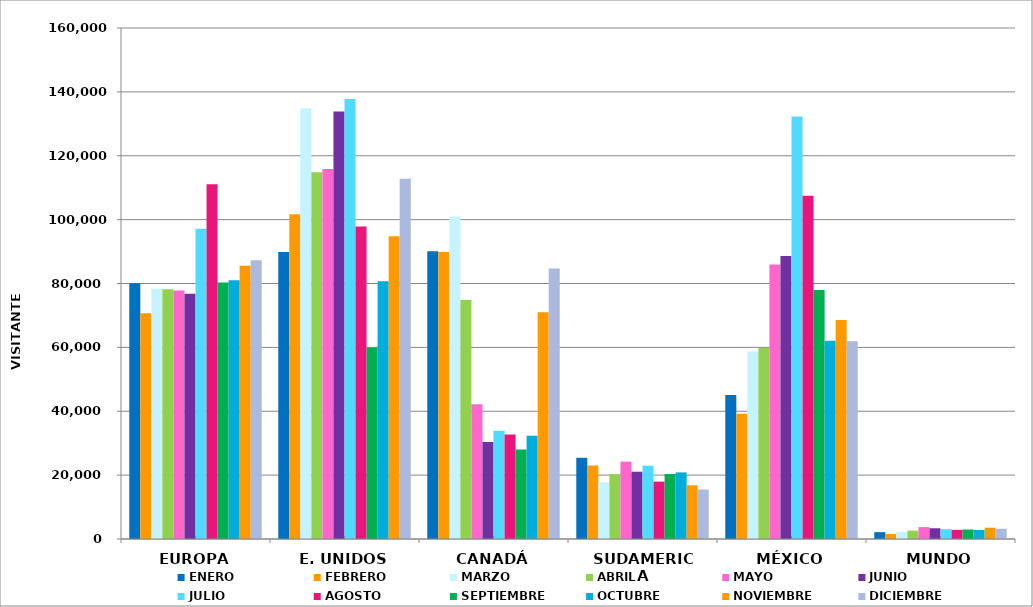
| Category | ENERO | FEBRERO | MARZO | ABRIL | MAYO | JUNIO | JULIO | AGOSTO | SEPTIEMBRE | OCTUBRE | NOVIEMBRE | DICIEMBRE |
|---|---|---|---|---|---|---|---|---|---|---|---|---|
| EUROPA | 80085 | 70666 | 78329 | 78183 | 77835 | 76823 | 97166 | 111040 | 80294 | 81027 | 85590 | 87248 |
| E. UNIDOS | 89850 | 101692 | 134892 | 114837 | 115835 | 133819 | 137782 | 97886 | 59984 | 80738 | 94756 | 112802 |
| CANADÁ | 90095 | 89828 | 100975 | 74825 | 42209 | 30352 | 33911 | 32748 | 28024 | 32366 | 70961 | 84735 |
| SUDAMERICA | 25423 | 23012 | 17763 | 20309 | 24229 | 21069 | 22951 | 17966 | 20342 | 20854 | 16821 | 15490 |
| MÉXICO | 45101 | 39217 | 58678 | 59804 | 85925 | 88609 | 132262 | 107465 | 77960 | 62039 | 68592 | 61941 |
| MUNDO | 2144 | 1602 | 2215 | 2614 | 3731 | 3362 | 3065 | 2859 | 2977 | 2814 | 3535 | 3207 |